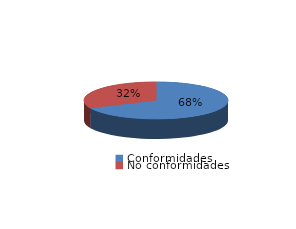
| Category | Series 0 |
|---|---|
| Conformidades | 130 |
| No conformidades | 61 |